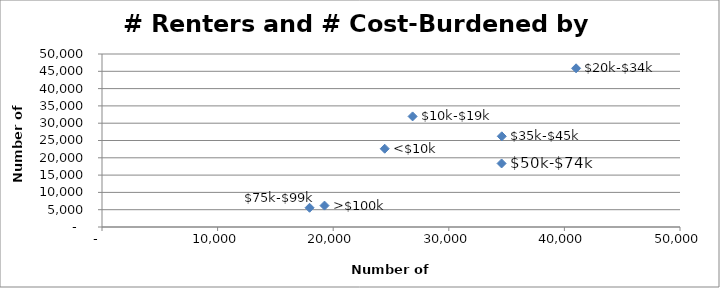
| Category |   Less than $10,000: |
|---|---|
| 24457.0 | 22621 |
| 26868.0 | 31961 |
| 41010.0 | 45866 |
| 34582.0 | 26214 |
| 34566.0 | 18366 |
| 17954.0 | 5555 |
| 19248.0 | 6187 |